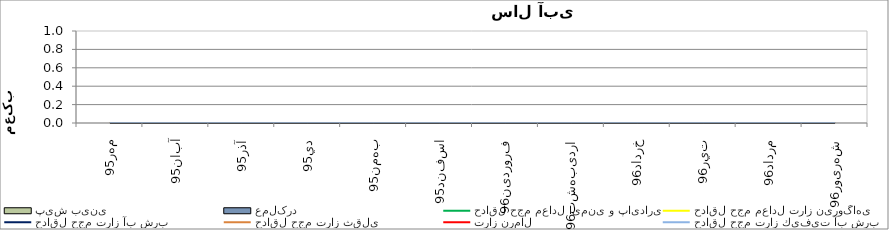
| Category | حداقل حجم معادل ایمنی و پایداری | حداقل حجم معادل تراز نیروگاهی | حداقل حجم تراز آب شرب | حداقل حجم تراز ثقلي | تراز نرمال | حداقل حجم تراز كيفيت آب شرب |
|---|---|---|---|---|---|---|
| مهر95 | 0 | 0 | 0 | 0 | 0 | 0 |
| آبان95 | 0 | 0 | 0 | 0 | 0 | 0 |
| آذر95 | 0 | 0 | 0 | 0 | 0 | 0 |
| دي95 | 0 | 0 | 0 | 0 | 0 | 0 |
| بهمن95 | 0 | 0 | 0 | 0 | 0 | 0 |
| اسفند95 | 0 | 0 | 0 | 0 | 0 | 0 |
| فروردین96 | 0 | 0 | 0 | 0 | 0 | 0 |
| اردیبهشت96 | 0 | 0 | 0 | 0 | 0 | 0 |
| خرداد96 | 0 | 0 | 0 | 0 | 0 | 0 |
| تير96 | 0 | 0 | 0 | 0 | 0 | 0 |
| مرداد96 | 0 | 0 | 0 | 0 | 0 | 0 |
| شهریور96 | 0 | 0 | 0 | 0 | 0 | 0 |